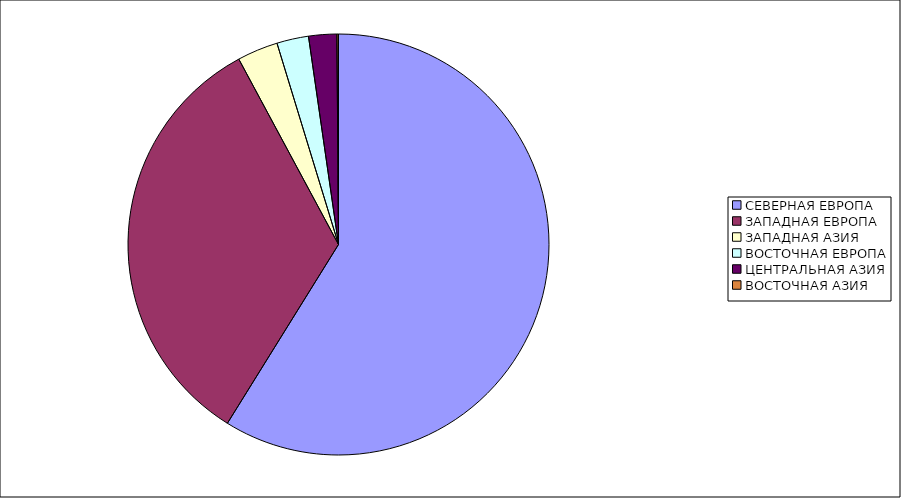
| Category | Оборот |
|---|---|
| СЕВЕРНАЯ ЕВРОПА | 58.849 |
| ЗАПАДНАЯ ЕВРОПА | 33.297 |
| ЗАПАДНАЯ АЗИЯ | 3.133 |
| ВОСТОЧНАЯ ЕВРОПА | 2.441 |
| ЦЕНТРАЛЬНАЯ АЗИЯ | 2.158 |
| ВОСТОЧНАЯ АЗИЯ | 0.121 |